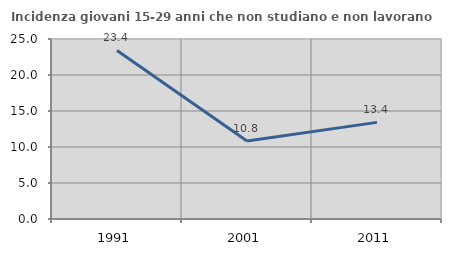
| Category | Incidenza giovani 15-29 anni che non studiano e non lavorano  |
|---|---|
| 1991.0 | 23.41 |
| 2001.0 | 10.828 |
| 2011.0 | 13.42 |